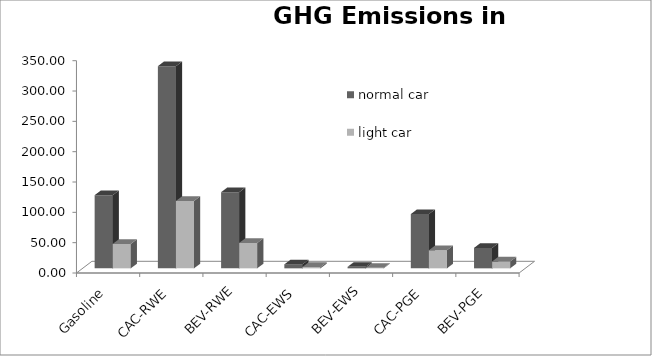
| Category | normal car | light car |
|---|---|---|
| Gasoline | 120.64 | 40.213 |
| CAC-RWE | 333.305 | 111.102 |
| BEV-RWE | 125.561 | 41.854 |
| CAC-EWS | 6.501 | 2.167 |
| BEV-EWS | 2.449 | 0.816 |
| CAC-PGE | 89.433 | 29.811 |
| BEV-PGE | 33.691 | 11.23 |